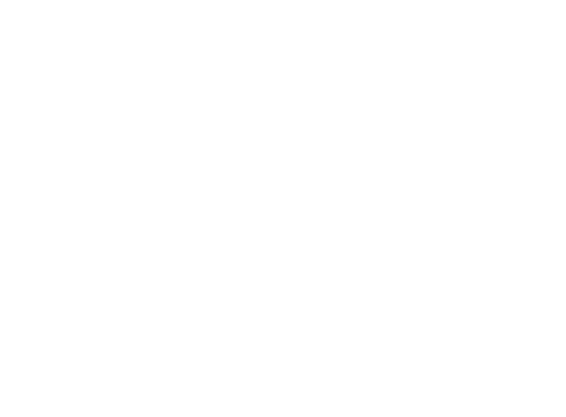
| Category | Tons |
|---|---|
| Residential Refuse that Would be Accepted By Residential SSO Collection Program | 0 |
| Residential Refuse that Would Not Accepted be by Residential SSO Program | 0 |